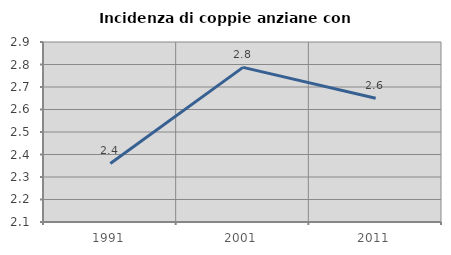
| Category | Incidenza di coppie anziane con figli |
|---|---|
| 1991.0 | 2.36 |
| 2001.0 | 2.787 |
| 2011.0 | 2.65 |